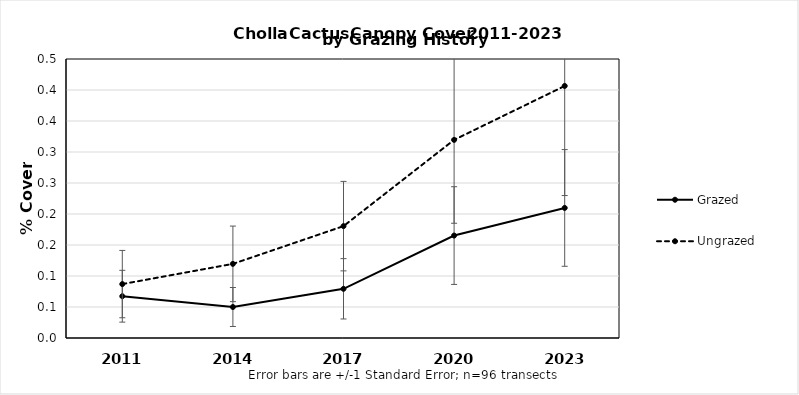
| Category | Grazed | Ungrazed |
|---|---|---|
| 2011.0 | 0.067 | 0.087 |
| 2014.0 | 0.05 | 0.12 |
| 2017.0 | 0.079 | 0.18 |
| 2020.0 | 0.165 | 0.32 |
| 2023.0 | 0.21 | 0.407 |